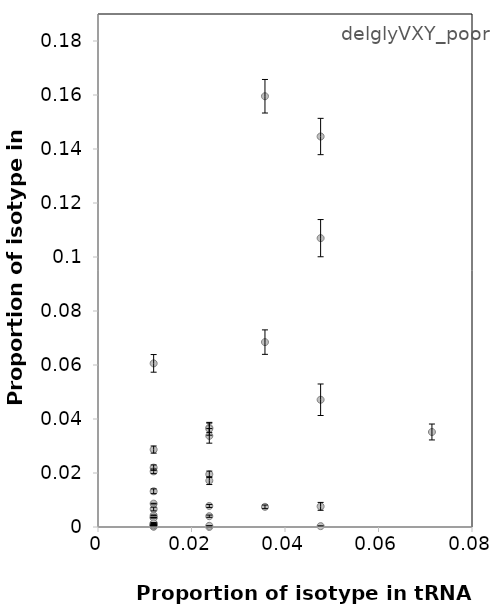
| Category | SBW25 |
|---|---|
| 0.023809523809523808 | 0.037 |
| 0.03571428571428571 | 0.068 |
| 0.047619047619047616 | 0.008 |
| 0.011904761904761904 | 0.001 |
| 0.011904761904761904 | 0 |
| 0.011904761904761904 | 0.004 |
| 0.047619047619047616 | 0.107 |
| 0.03571428571428571 | 0.16 |
| 0.011904761904761904 | 0.013 |
| 0.047619047619047616 | 0 |
| 0.023809523809523808 | 0.034 |
| 0.023809523809523808 | 0.036 |
| 0.047619047619047616 | 0.145 |
| 0.011904761904761904 | 0.009 |
| 0.011904761904761904 | 0.061 |
| 0.011904761904761904 | 0.022 |
| 0.011904761904761904 | 0 |
| 0.023809523809523808 | 0 |
| 0.03571428571428571 | 0.007 |
| 0.011904761904761904 | 0 |
| 0.047619047619047616 | 0.047 |
| 0.011904761904761904 | 0.001 |
| 0.011904761904761904 | 0.001 |
| 0.011904761904761904 | 0.007 |
| 0.07142857142857142 | 0.035 |
| 0.023809523809523808 | 0.008 |
| 0.023809523809523808 | 0 |
| 0.011904761904761904 | 0.001 |
| 0.011904761904761904 | 0.003 |
| 0.011904761904761904 | 0.003 |
| 0.011904761904761904 | 0 |
| 0.011904761904761904 | 0 |
| 0.011904761904761904 | 0.029 |
| 0.023809523809523808 | 0.02 |
| 0.011904761904761904 | 0.001 |
| 0.023809523809523808 | 0.004 |
| 0.023809523809523808 | 0.017 |
| 0.011904761904761904 | 0.021 |
| 0.011904761904761904 | 0.001 |